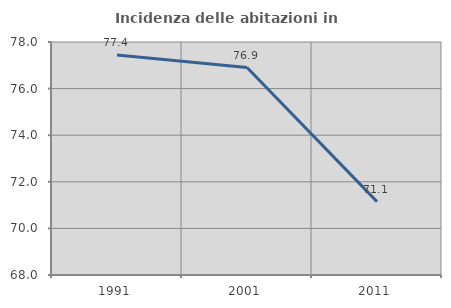
| Category | Incidenza delle abitazioni in proprietà  |
|---|---|
| 1991.0 | 77.442 |
| 2001.0 | 76.905 |
| 2011.0 | 71.149 |